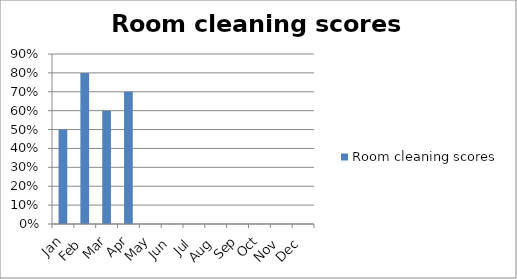
| Category | Room cleaning scores |
|---|---|
| Jan | 0.5 |
| Feb | 0.8 |
| Mar | 0.6 |
| Apr | 0.7 |
| May | 0 |
| Jun | 0 |
| Jul | 0 |
| Aug | 0 |
| Sep | 0 |
| Oct | 0 |
| Nov | 0 |
| Dec | 0 |